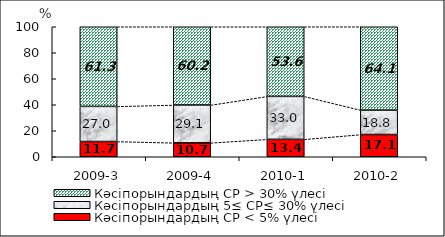
| Category | Кәсіпорындардың СР < 5% үлесі | Кәсіпорындардың 5≤ СР≤ 30% үлесі | Кәсіпорындардың СР > 30% үлесі |
|---|---|---|---|
| 2009-3 | 11.736 | 27.006 | 61.258 |
| 2009-4 | 10.696 | 29.1 | 60.204 |
| 2010-1 | 13.413 | 33.016 | 53.571 |
| 2010-2 | 17.094 | 18.803 | 64.103 |